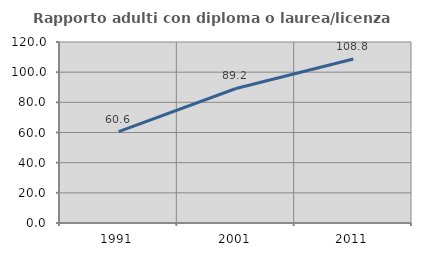
| Category | Rapporto adulti con diploma o laurea/licenza media  |
|---|---|
| 1991.0 | 60.575 |
| 2001.0 | 89.174 |
| 2011.0 | 108.777 |